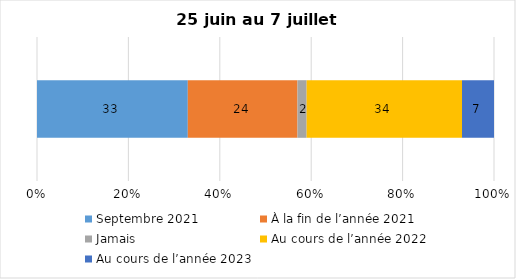
| Category | Septembre 2021 | À la fin de l’année 2021 | Jamais | Au cours de l’année 2022 | Au cours de l’année 2023 |
|---|---|---|---|---|---|
| 0 | 33 | 24 | 2 | 34 | 7 |